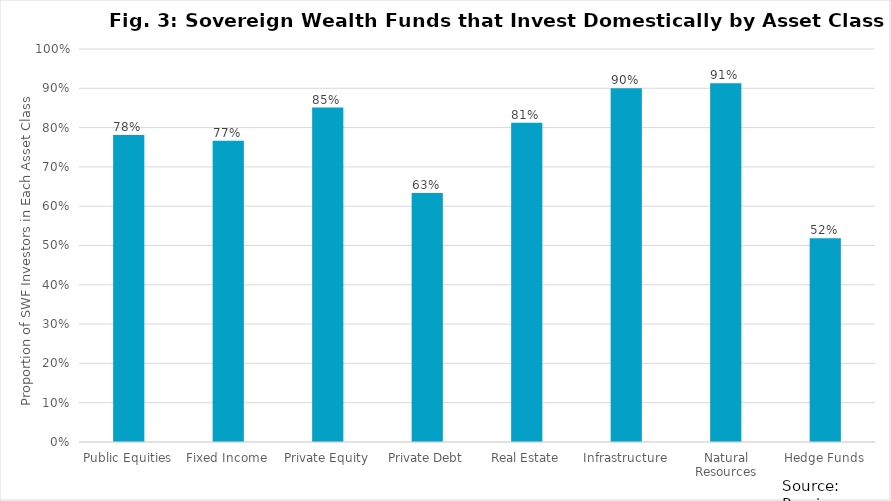
| Category | Series 0 |
|---|---|
| Public Equities | 0.781 |
| Fixed Income | 0.767 |
| Private Equity | 0.851 |
| Private Debt | 0.633 |
| Real Estate | 0.812 |
| Infrastructure | 0.9 |
| Natural Resources | 0.913 |
| Hedge Funds | 0.519 |